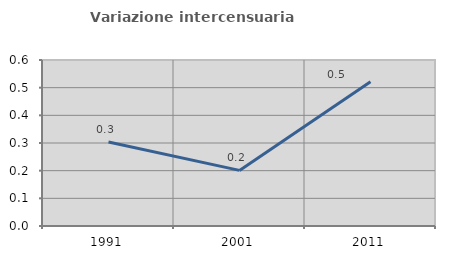
| Category | Variazione intercensuaria annua |
|---|---|
| 1991.0 | 0.304 |
| 2001.0 | 0.201 |
| 2011.0 | 0.521 |